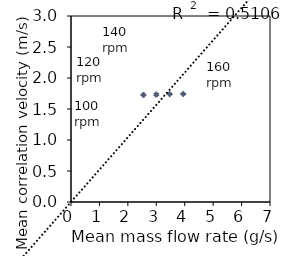
| Category | Series 0 |
|---|---|
| 2.548033333333333 | 1.727 |
| 3.0005666666666664 | 1.732 |
| 3.4709 | 1.74 |
| 3.9486666666666665 | 1.742 |